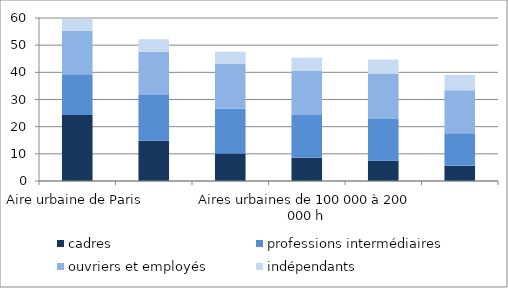
| Category | cadres | professions intermédiaires | ouvriers et employés | indépendants |
|---|---|---|---|---|
| Aire urbaine de Paris | 24.309 | 15.011 | 15.93 | 4.491 |
| Aires urbaines de plus de 500 000 h (sauf Paris) | 14.809 | 16.851 | 15.869 | 4.654 |
| Aires urbaines de 200 000 à 500 000 h | 10.134 | 16.458 | 16.503 | 4.514 |
| Aires urbaines de 100 000 à 200 000 h | 8.532 | 15.788 | 16.312 | 4.733 |
| Aires urbaines de moins de 1000 000 h | 7.466 | 15.367 | 16.717 | 5.143 |
| Hors grandes aires urbaines | 5.568 | 11.968 | 15.884 | 5.631 |